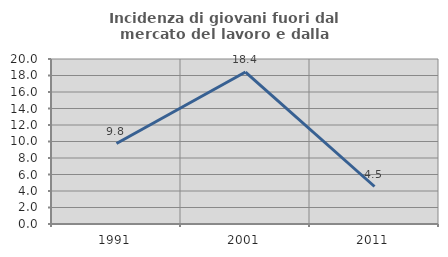
| Category | Incidenza di giovani fuori dal mercato del lavoro e dalla formazione  |
|---|---|
| 1991.0 | 9.756 |
| 2001.0 | 18.421 |
| 2011.0 | 4.545 |